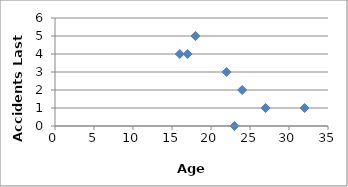
| Category | Accidents |
|---|---|
| 16.0 | 4 |
| 24.0 | 2 |
| 18.0 | 5 |
| 17.0 | 4 |
| 23.0 | 0 |
| 27.0 | 1 |
| 32.0 | 1 |
| 22.0 | 3 |